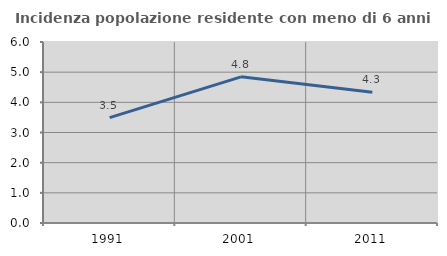
| Category | Incidenza popolazione residente con meno di 6 anni |
|---|---|
| 1991.0 | 3.492 |
| 2001.0 | 4.845 |
| 2011.0 | 4.333 |